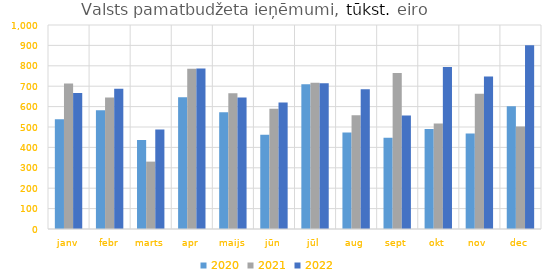
| Category | 2020 | 2021 | 2022 |
|---|---|---|---|
| janv | 537722.948 | 713014.632 | 666661.352 |
| febr | 582097.989 | 644814.957 | 687779.931 |
| marts | 436083.224 | 330339.758 | 487592.334 |
| apr | 645256.276 | 785719.324 | 787062.79 |
| maijs | 572854.69 | 665234.221 | 644004.073 |
| jūn | 461405.873 | 589166.177 | 620273.485 |
| jūl | 709928.085 | 717458.088 | 713962.301 |
| aug | 472605.695 | 557138.062 | 685067.765 |
| sept | 446749.915 | 764496.897 | 556332.319 |
| okt | 490335.515 | 516906.965 | 794230.202 |
| nov | 468560.222 | 662718.632 | 747989.336 |
| dec | 601482.069 | 502474.488 | 900960.999 |